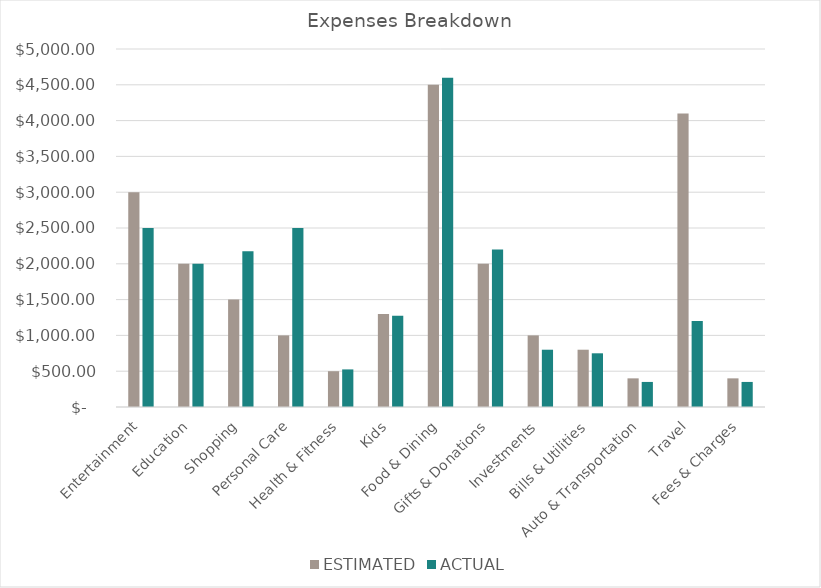
| Category | ESTIMATED | ACTUAL | TOP 5 AMOUNT |
|---|---|---|---|
| Entertainment | 3000 | 2500 |  |
| Education | 2000 | 2000 |  |
| Shopping | 1500 | 2175 |  |
| Personal Care | 1000 | 2500 |  |
| Health & Fitness | 500 | 525 |  |
| Kids | 1300 | 1275 |  |
| Food & Dining | 4500 | 4600 |  |
| Gifts & Donations | 2000 | 2200 |  |
| Investments | 1000 | 800 |  |
| Bills & Utilities | 800 | 750 |  |
| Auto & Transportation | 400 | 350 |  |
| Travel | 4100 | 1200 |  |
| Fees & Charges | 400 | 350 |  |